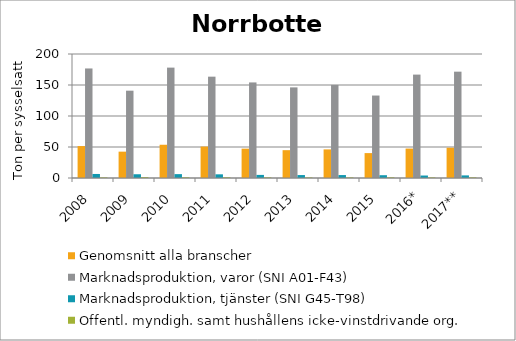
| Category | Genomsnitt alla branscher | Marknadsproduktion, varor (SNI A01-F43) | Marknadsproduktion, tjänster (SNI G45-T98) | Offentl. myndigh. samt hushållens icke-vinstdrivande org. |
|---|---|---|---|---|
| 2008 | 51.5 | 176.678 | 6.505 | 0.974 |
| 2009 | 42.5 | 140.83 | 6.046 | 1.402 |
| 2010 | 53.619 | 178.044 | 6.234 | 1.121 |
| 2011 | 50.696 | 163.446 | 5.928 | 1.179 |
| 2012 | 47.332 | 154.148 | 4.996 | 1.044 |
| 2013 | 44.888 | 146.151 | 4.752 | 0.939 |
| 2014 | 46.124 | 150.09 | 4.738 | 0.997 |
| 2015 | 40.16 | 133.003 | 4.512 | 1.123 |
| 2016* | 47.472 | 166.768 | 3.987 | 0.989 |
| 2017** | 48.82 | 171.499 | 4.199 | 1.042 |